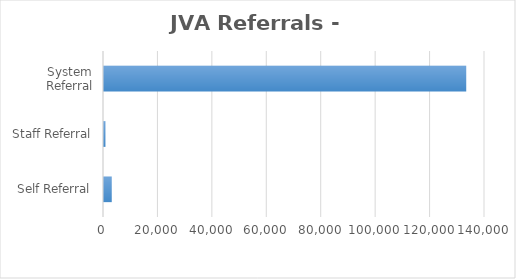
| Category | Series 0 |
|---|---|
| Self Referral | 2851 |
| Staff Referral | 534 |
| System Referral | 133106 |